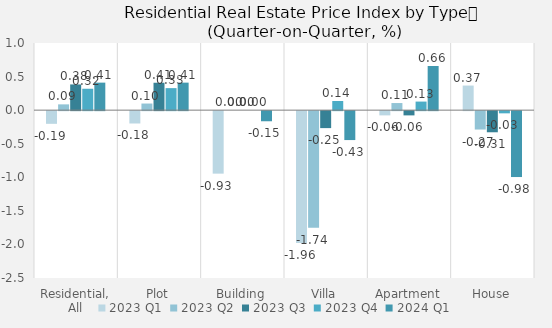
| Category | 2023 | 2024 |
|---|---|---|
| Residential, All | 0.319 | 0.41 |
| Plot | 0.328 | 0.41 |
| Building | 0 | -0.151 |
| Villa | 0.136 | -0.431 |
| Apartment | 0.128 | 0.658 |
| House | -0.033 | -0.981 |